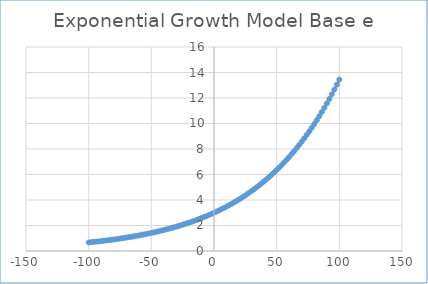
| Category | Series 0 |
|---|---|
| -100.0 | 0.669 |
| -98.0 | 0.69 |
| -96.0 | 0.711 |
| -94.0 | 0.732 |
| -92.0 | 0.755 |
| -90.0 | 0.778 |
| -88.0 | 0.801 |
| -86.0 | 0.826 |
| -84.0 | 0.851 |
| -82.0 | 0.877 |
| -80.0 | 0.904 |
| -78.0 | 0.931 |
| -76.0 | 0.959 |
| -74.0 | 0.989 |
| -72.0 | 1.019 |
| -70.0 | 1.05 |
| -68.0 | 1.082 |
| -66.0 | 1.115 |
| -64.0 | 1.149 |
| -62.0 | 1.184 |
| -60.0 | 1.22 |
| -58.0 | 1.257 |
| -56.0 | 1.295 |
| -54.0 | 1.335 |
| -52.0 | 1.375 |
| -50.0 | 1.417 |
| -48.0 | 1.46 |
| -46.0 | 1.505 |
| -44.0 | 1.551 |
| -42.0 | 1.598 |
| -40.0 | 1.646 |
| -38.0 | 1.697 |
| -36.0 | 1.748 |
| -34.0 | 1.801 |
| -32.0 | 1.856 |
| -30.0 | 1.913 |
| -28.0 | 1.971 |
| -26.0 | 2.031 |
| -24.0 | 2.093 |
| -22.0 | 2.157 |
| -20.0 | 2.222 |
| -18.0 | 2.29 |
| -16.0 | 2.36 |
| -14.0 | 2.432 |
| -12.0 | 2.506 |
| -10.0 | 2.582 |
| -8.0 | 2.661 |
| -6.0 | 2.742 |
| -4.0 | 2.825 |
| -2.0 | 2.911 |
| 0.0 | 3 |
| 2.0 | 3.091 |
| 4.0 | 3.186 |
| 6.0 | 3.283 |
| 8.0 | 3.382 |
| 10.0 | 3.486 |
| 12.0 | 3.592 |
| 14.0 | 3.701 |
| 16.0 | 3.814 |
| 18.0 | 3.93 |
| 20.0 | 4.05 |
| 22.0 | 4.173 |
| 24.0 | 4.3 |
| 26.0 | 4.431 |
| 28.0 | 4.566 |
| 30.0 | 4.705 |
| 32.0 | 4.848 |
| 34.0 | 4.996 |
| 36.0 | 5.148 |
| 38.0 | 5.305 |
| 40.0 | 5.466 |
| 42.0 | 5.633 |
| 44.0 | 5.804 |
| 46.0 | 5.981 |
| 48.0 | 6.163 |
| 50.0 | 6.351 |
| 52.0 | 6.544 |
| 54.0 | 6.744 |
| 56.0 | 6.949 |
| 58.0 | 7.161 |
| 60.0 | 7.379 |
| 62.0 | 7.604 |
| 64.0 | 7.835 |
| 66.0 | 8.074 |
| 68.0 | 8.32 |
| 70.0 | 8.573 |
| 72.0 | 8.834 |
| 74.0 | 9.103 |
| 76.0 | 9.38 |
| 78.0 | 9.666 |
| 80.0 | 9.96 |
| 82.0 | 10.264 |
| 84.0 | 10.576 |
| 86.0 | 10.898 |
| 88.0 | 11.23 |
| 90.0 | 11.572 |
| 92.0 | 11.925 |
| 94.0 | 12.288 |
| 96.0 | 12.662 |
| 98.0 | 13.048 |
| 100.0 | 13.445 |